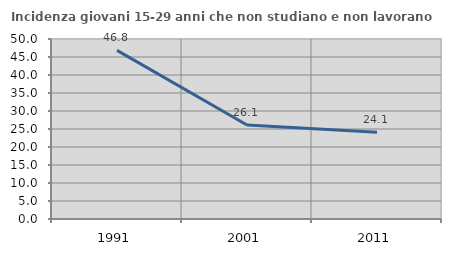
| Category | Incidenza giovani 15-29 anni che non studiano e non lavorano  |
|---|---|
| 1991.0 | 46.831 |
| 2001.0 | 26.128 |
| 2011.0 | 24.064 |